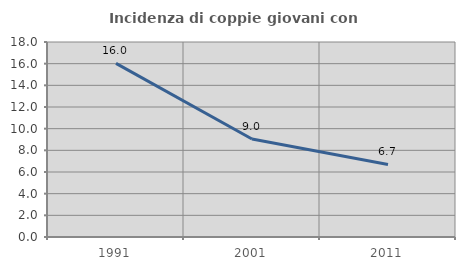
| Category | Incidenza di coppie giovani con figli |
|---|---|
| 1991.0 | 16.023 |
| 2001.0 | 9.041 |
| 2011.0 | 6.693 |